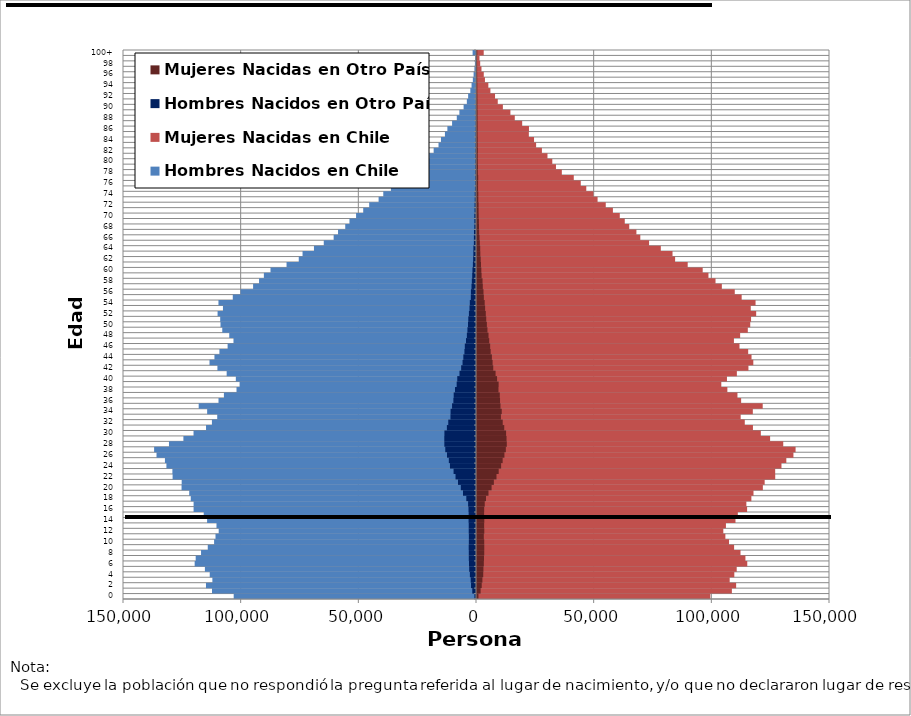
| Category | Hombres Nacidos en Chile | Mujeres Nacidas en Chile | Hombres Nacidos en Otro País | Mujeres Nacidas en Otro País |
|---|---|---|---|---|
| 0 | -102965 | 99156 | -668 | 615 |
| 1 | -112177 | 108307 | -1581 | 1531 |
| 2 | -114739 | 110115 | -2111 | 2005 |
| 3 | -112026 | 107378 | -2252 | 2295 |
| 4 | -113142 | 109341 | -2607 | 2649 |
| 5 | -115201 | 110359 | -2895 | 2727 |
| 6 | -119547 | 114841 | -2983 | 2898 |
| 7 | -119110 | 114061 | -3060 | 2970 |
| 8 | -116838 | 111973 | -3067 | 3081 |
| 9 | -113981 | 109250 | -3108 | 3094 |
| 10 | -111291 | 107098 | -3047 | 3071 |
| 11 | -110692 | 105540 | -3033 | 2902 |
| 12 | -109336 | 104667 | -3096 | 3098 |
| 13 | -110276 | 105778 | -3092 | 3037 |
| 14 | -114263 | 109836 | -3160 | 3106 |
| 15 | -115701 | 110832 | -3128 | 3022 |
| 16 | -120007 | 114777 | -3190 | 3052 |
| 17 | -120003 | 114461 | -3359 | 3292 |
| 18 | -121202 | 116587 | -4122 | 3837 |
| 19 | -121861 | 117492 | -5530 | 4884 |
| 20 | -125116 | 121470 | -6457 | 6200 |
| 21 | -125066 | 122239 | -7657 | 7165 |
| 22 | -128920 | 126721 | -8702 | 8290 |
| 23 | -129015 | 126706 | -9535 | 9219 |
| 24 | -131553 | 129380 | -11064 | 10253 |
| 25 | -132182 | 131442 | -11549 | 10904 |
| 26 | -135758 | 134459 | -12335 | 11651 |
| 27 | -136780 | 135375 | -13059 | 12256 |
| 28 | -130466 | 130131 | -13454 | 12661 |
| 29 | -124335 | 124548 | -13478 | 12556 |
| 30 | -120031 | 120607 | -13423 | 12365 |
| 31 | -114717 | 117254 | -12377 | 11579 |
| 32 | -112216 | 113791 | -11791 | 10934 |
| 33 | -109964 | 112045 | -10855 | 10170 |
| 34 | -114244 | 117206 | -10810 | 10518 |
| 35 | -117835 | 121405 | -10178 | 9989 |
| 36 | -109417 | 112238 | -9616 | 9794 |
| 37 | -107125 | 110676 | -9480 | 9685 |
| 38 | -101767 | 106387 | -8912 | 9124 |
| 39 | -100452 | 103814 | -8220 | 9194 |
| 40 | -102055 | 106217 | -7967 | 8533 |
| 41 | -105947 | 110425 | -7016 | 7895 |
| 42 | -109882 | 115342 | -6310 | 6903 |
| 43 | -113239 | 117413 | -5717 | 6632 |
| 44 | -111143 | 116658 | -5382 | 6327 |
| 45 | -109033 | 115231 | -4924 | 5814 |
| 46 | -105547 | 111540 | -4757 | 5598 |
| 47 | -103056 | 109176 | -4255 | 5197 |
| 48 | -104851 | 111815 | -3883 | 4896 |
| 49 | -107820 | 115077 | -3646 | 4442 |
| 50 | -108568 | 116104 | -3403 | 4197 |
| 51 | -108700 | 116458 | -3278 | 3927 |
| 52 | -109811 | 118629 | -3010 | 3738 |
| 53 | -107526 | 116333 | -2763 | 3455 |
| 54 | -109439 | 118366 | -2634 | 3268 |
| 55 | -103353 | 112465 | -2207 | 2913 |
| 56 | -100084 | 109537 | -2165 | 2757 |
| 57 | -94718 | 104044 | -1916 | 2467 |
| 58 | -92190 | 101358 | -1772 | 2352 |
| 59 | -90141 | 98352 | -1607 | 1954 |
| 60 | -87327 | 95906 | -1506 | 1840 |
| 61 | -80504 | 89534 | -1319 | 1709 |
| 62 | -75318 | 84183 | -1211 | 1574 |
| 63 | -73705 | 83083 | -1126 | 1417 |
| 64 | -68855 | 78109 | -1106 | 1365 |
| 65 | -64689 | 73120 | -902 | 1199 |
| 66 | -60488 | 69389 | -895 | 1071 |
| 67 | -58625 | 67739 | -852 | 914 |
| 68 | -55563 | 64691 | -713 | 861 |
| 69 | -53775 | 62794 | -683 | 809 |
| 70 | -50958 | 60674 | -705 | 715 |
| 71 | -47925 | 57749 | -610 | 679 |
| 72 | -45388 | 54716 | -596 | 671 |
| 73 | -41388 | 51240 | -537 | 558 |
| 74 | -39402 | 49456 | -526 | 556 |
| 75 | -36162 | 46439 | -441 | 463 |
| 76 | -33353 | 44098 | -387 | 468 |
| 77 | -30247 | 41122 | -401 | 512 |
| 78 | -26265 | 36048 | -372 | 389 |
| 79 | -23900 | 33559 | -358 | 409 |
| 80 | -22312 | 31994 | -341 | 345 |
| 81 | -19892 | 29949 | -342 | 324 |
| 82 | -17994 | 27584 | -305 | 358 |
| 83 | -15926 | 25118 | -285 | 313 |
| 84 | -14890 | 24238 | -254 | 310 |
| 85 | -13206 | 22034 | -252 | 273 |
| 86 | -12164 | 22085 | -231 | 282 |
| 87 | -10163 | 19199 | -205 | 271 |
| 88 | -8165 | 16055 | -171 | 241 |
| 89 | -7060 | 14195 | -167 | 245 |
| 90 | -5272 | 10995 | -148 | 191 |
| 91 | -3895 | 8825 | -100 | 190 |
| 92 | -3344 | 7665 | -80 | 166 |
| 93 | -2412 | 5696 | -81 | 143 |
| 94 | -1888 | 4819 | -73 | 139 |
| 95 | -1346 | 3380 | -36 | 101 |
| 96 | -1017 | 2878 | -31 | 77 |
| 97 | -674 | 1904 | -33 | 55 |
| 98 | -462 | 1354 | -13 | 40 |
| 99 | -339 | 1054 | -14 | 23 |
| 100 | -1437 | 2850 | -81 | 119 |